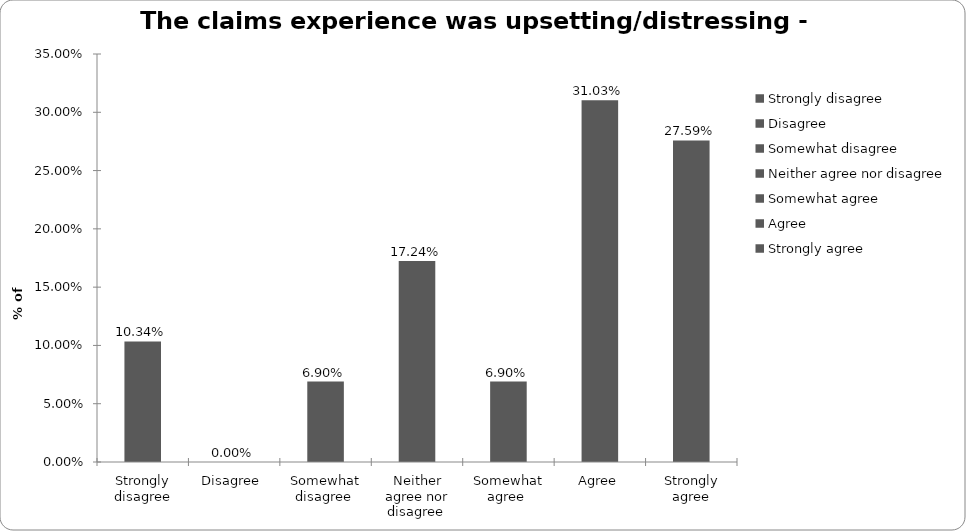
| Category | Series 0 |
|---|---|
| Strongly disagree | 0.103 |
| Disagree  | 0 |
| Somewhat disagree  | 0.069 |
| Neither agree nor disagree  | 0.172 |
| Somewhat agree  | 0.069 |
| Agree | 0.31 |
| Strongly agree | 0.276 |